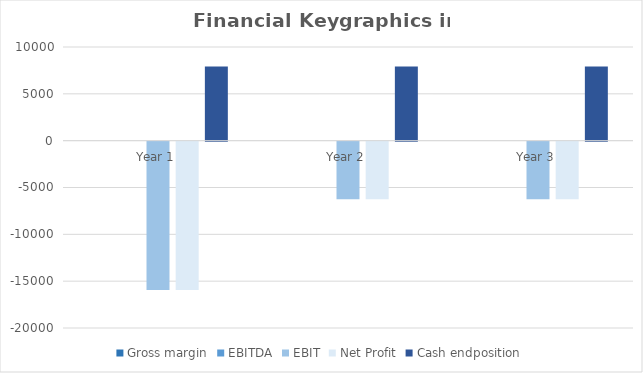
| Category | Gross margin | EBITDA | EBIT | Net Profit | Cash endposition |
|---|---|---|---|---|---|
| Year 1 | 0 | 0 | -15824.683 | -15824.683 | 7912.341 |
| Year 2 | 0 | 0 | -6136.101 | -6136.101 | 7912.341 |
| Year 3 | 0 | 0 | -6136.101 | -6136.101 | 7912.341 |